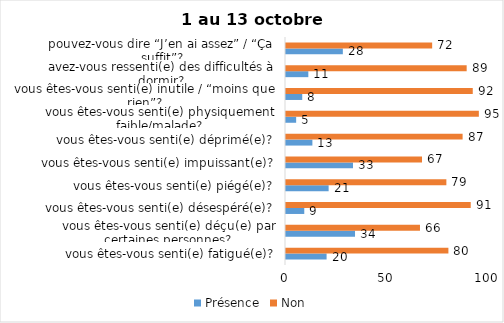
| Category | Présence | Non |
|---|---|---|
| vous êtes-vous senti(e) fatigué(e)? | 20 | 80 |
| vous êtes-vous senti(e) déçu(e) par certaines personnes? | 34 | 66 |
| vous êtes-vous senti(e) désespéré(e)? | 9 | 91 |
| vous êtes-vous senti(e) piégé(e)? | 21 | 79 |
| vous êtes-vous senti(e) impuissant(e)? | 33 | 67 |
| vous êtes-vous senti(e) déprimé(e)? | 13 | 87 |
| vous êtes-vous senti(e) physiquement faible/malade? | 5 | 95 |
| vous êtes-vous senti(e) inutile / “moins que rien”? | 8 | 92 |
| avez-vous ressenti(e) des difficultés à dormir? | 11 | 89 |
| pouvez-vous dire “J’en ai assez” / “Ça suffit”? | 28 | 72 |